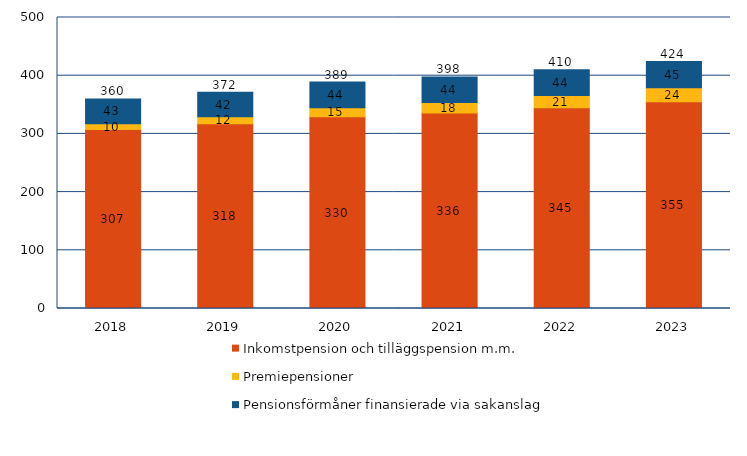
| Category | Inkomstpension och tilläggspension m.m. | Premiepensioner | Pensionsförmåner finansierade via sakanslag | Series 3 |
|---|---|---|---|---|
| 2018.0 | 307.356 | 10.141 | 42.538 | 360.035 |
| 2019.0 | 317.627 | 11.715 | 42.209 | 371.55 |
| 2020.0 | 329.602 | 15.203 | 44.336 | 389.141 |
| 2021.0 | 335.926 | 17.844 | 44.057 | 397.827 |
| 2022.0 | 345.145 | 20.826 | 44.336 | 410.307 |
| 2023.0 | 355.245 | 24.075 | 45.144 | 424.464 |